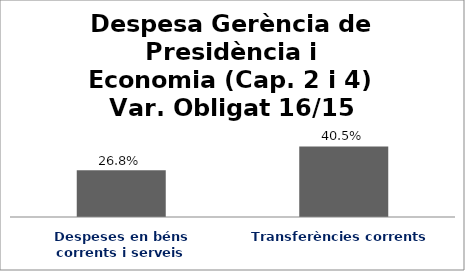
| Category | Series 0 |
|---|---|
| Despeses en béns corrents i serveis | 0.268 |
| Transferències corrents | 0.405 |